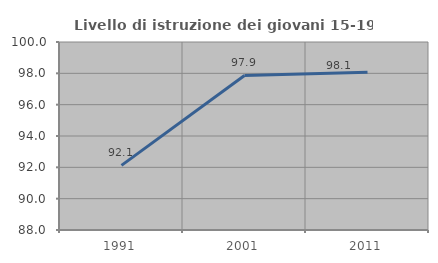
| Category | Livello di istruzione dei giovani 15-19 anni |
|---|---|
| 1991.0 | 92.124 |
| 2001.0 | 97.864 |
| 2011.0 | 98.074 |